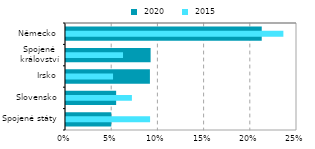
| Category |  2020 |
|---|---|
| Spojené státy | 0.049 |
| Slovensko | 0.054 |
| Irsko | 0.091 |
| Spojené
království | 0.092 |
| Německo | 0.212 |